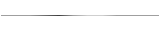
| Category | Series 0 |
|---|---|
| 0 | 0.029 |
| 1 | 0.034 |
| 2 | 0.026 |
| 3 | 0.039 |
| 4 | 0.055 |
| 5 | 0.024 |
| 6 | 0.023 |
| 7 | 0.019 |
| 8 | 0.028 |
| 9 | 0.028 |
| 10 | 0.025 |
| 11 | 0.025 |